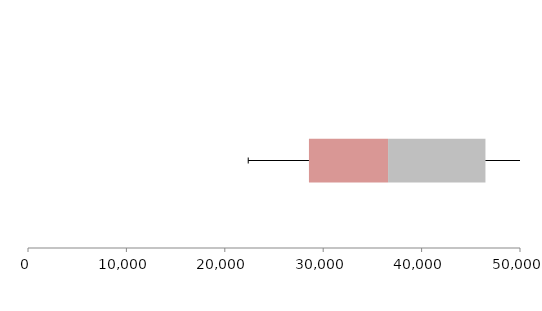
| Category | Series 1 | Series 2 | Series 3 |
|---|---|---|---|
| 0 | 28552.035 | 8040.118 | 9896.702 |